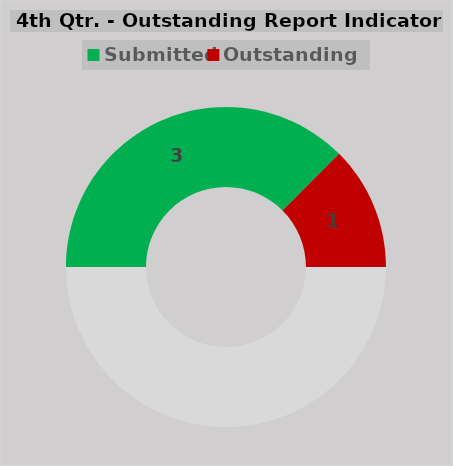
| Category | Series 0 |
|---|---|
|  | 4 |
| Submitted | 3 |
| Outstanding | 1 |